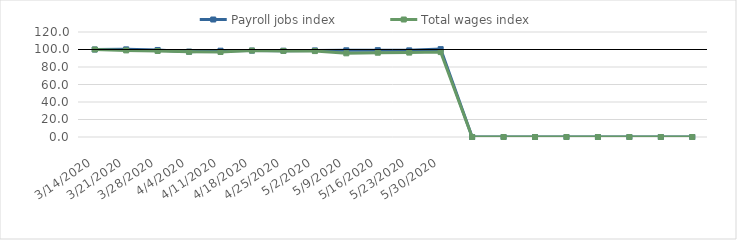
| Category | Payroll jobs index | Total wages index |
|---|---|---|
| 14/03/2020 | 100 | 100 |
| 21/03/2020 | 100.152 | 98.975 |
| 28/03/2020 | 99.448 | 98.282 |
| 04/04/2020 | 97.558 | 97.346 |
| 11/04/2020 | 98.632 | 97.138 |
| 18/04/2020 | 98.756 | 98.769 |
| 25/04/2020 | 98.588 | 98.36 |
| 02/05/2020 | 98.961 | 98.184 |
| 09/05/2020 | 99.079 | 95.627 |
| 16/05/2020 | 99.232 | 96.319 |
| 23/05/2020 | 99.003 | 96.46 |
| 30/05/2020 | 100.408 | 97.025 |